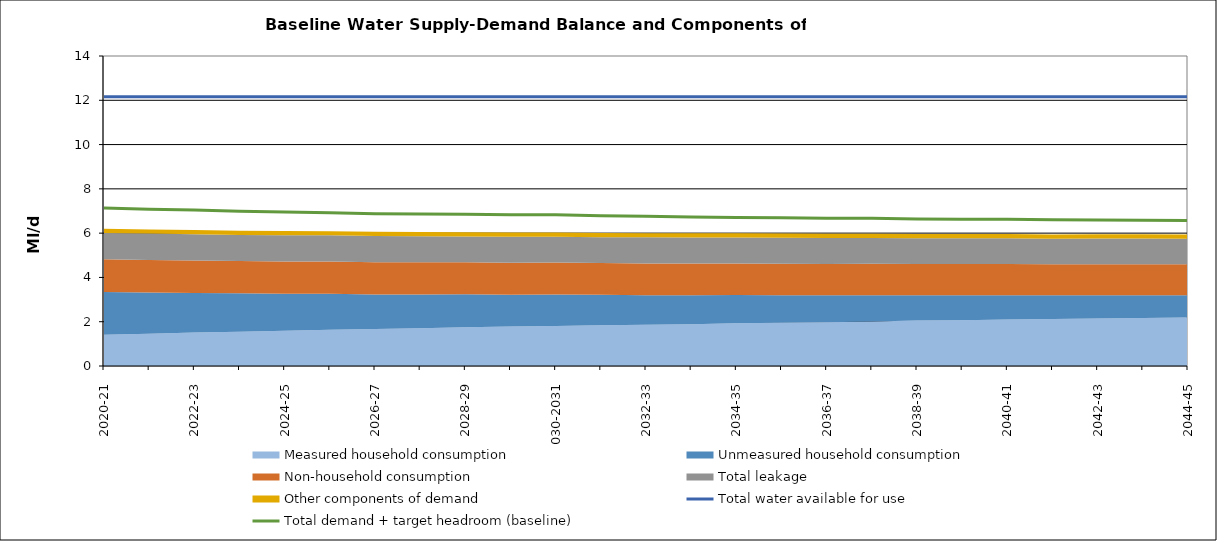
| Category | Total water available for use | Total demand + target headroom (baseline) |
|---|---|---|
| 0 | 12.16 | 7.14 |
| 1 | 12.16 | 7.08 |
| 2 | 12.16 | 7.04 |
| 3 | 12.16 | 6.99 |
| 4 | 12.16 | 6.95 |
| 5 | 12.16 | 6.92 |
| 6 | 12.16 | 6.88 |
| 7 | 12.16 | 6.86 |
| 8 | 12.16 | 6.85 |
| 9 | 12.16 | 6.83 |
| 10 | 12.16 | 6.83 |
| 11 | 12.16 | 6.79 |
| 12 | 12.16 | 6.76 |
| 13 | 12.16 | 6.73 |
| 14 | 12.16 | 6.71 |
| 15 | 12.16 | 6.69 |
| 16 | 12.16 | 6.67 |
| 17 | 12.16 | 6.67 |
| 18 | 12.16 | 6.64 |
| 19 | 12.16 | 6.63 |
| 20 | 12.16 | 6.63 |
| 21 | 12.16 | 6.6 |
| 22 | 12.16 | 6.59 |
| 23 | 12.16 | 6.58 |
| 24 | 12.16 | 6.57 |